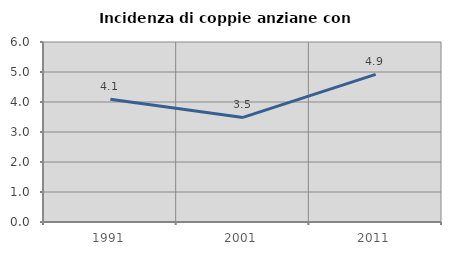
| Category | Incidenza di coppie anziane con figli |
|---|---|
| 1991.0 | 4.094 |
| 2001.0 | 3.485 |
| 2011.0 | 4.919 |